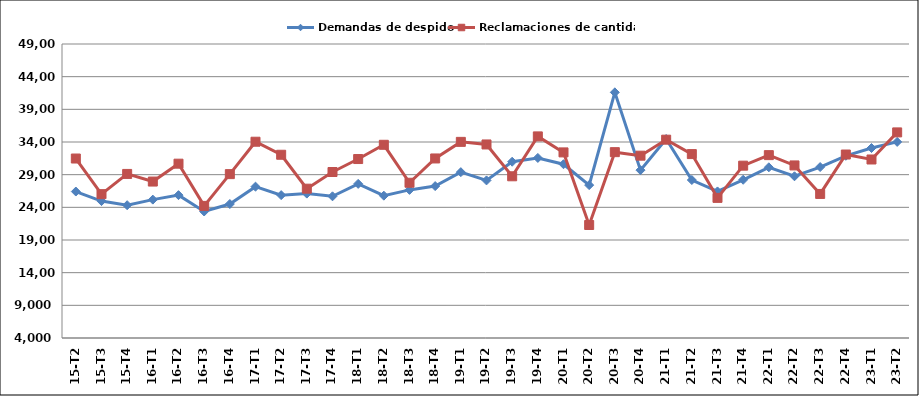
| Category | Demandas de despido | Reclamaciones de cantidad |
|---|---|---|
| 15-T2 | 26417 | 31470 |
| 15-T3 | 24957 | 26018 |
| 15-T4 | 24328 | 29112 |
| 16-T1 | 25182 | 27945 |
| 16-T2 | 25866 | 30682 |
| 16-T3 | 23364 | 24220 |
| 16-T4 | 24509 | 29081 |
| 17-T1 | 27166 | 34041 |
| 17-T2 | 25869 | 32047 |
| 17-T3 | 26101 | 26854 |
| 17-T4 | 25688 | 29408 |
| 18-T1 | 27589 | 31392 |
| 18-T2 | 25785 | 33573 |
| 18-T3 | 26669 | 27761 |
| 18-T4 | 27251 | 31480 |
| 19-T1 | 29386 | 34020 |
| 19-T2 | 28121 | 33623 |
| 19-T3 | 30981 | 28752 |
| 19-T4 | 31561 | 34857 |
| 20-T1 | 30597 | 32408 |
| 20-T2 | 27401 | 21297 |
| 20-T3 | 41597 | 32446 |
| 20-T4 | 29692 | 31906 |
| 21-T1 | 34461 | 34356 |
| 21-T2 | 28179 | 32151 |
| 21-T3 | 26434 | 25447 |
| 21-T4 | 28219 | 30377 |
| 22-T1 | 30126 | 31990 |
| 22-T2 | 28753 | 30414 |
| 22-T3 | 30167 | 26050 |
| 22-T4 | 31889 | 32084 |
| 23-T1 | 33079 | 31323 |
| 23-T2 | 34014 | 35469 |